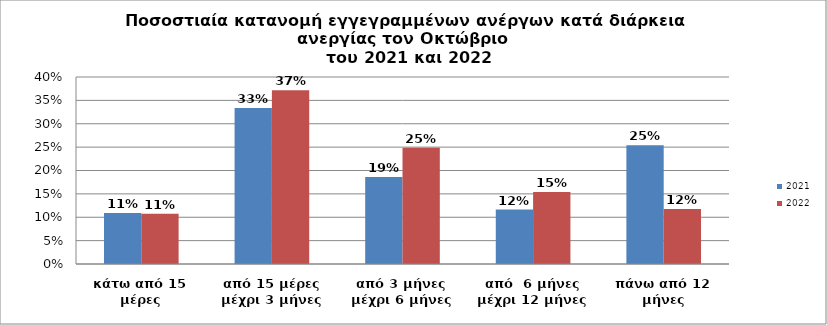
| Category | 2021 | 2022 |
|---|---|---|
| κάτω από 15 μέρες | 0.109 | 0.108 |
| από 15 μέρες μέχρι 3 μήνες | 0.334 | 0.372 |
| από 3 μήνες μέχρι 6 μήνες | 0.186 | 0.249 |
| από  6 μήνες μέχρι 12 μήνες | 0.117 | 0.154 |
| πάνω από 12 μήνες | 0.254 | 0.118 |